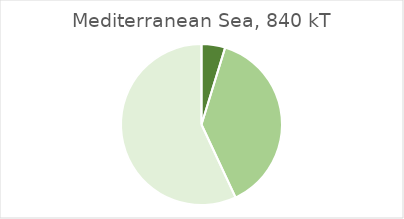
| Category | Mediterranean Sea |
|---|---|
| Landings of assessed stocks for which adequate information is available to determine GES for F and/or SSB | 39874.2 |
| Landings of assessed stocks for which insufficient information is available to determine GES for F and/or SSB | 321676.22 |
| Landings unassessed stocks | 478357.99 |